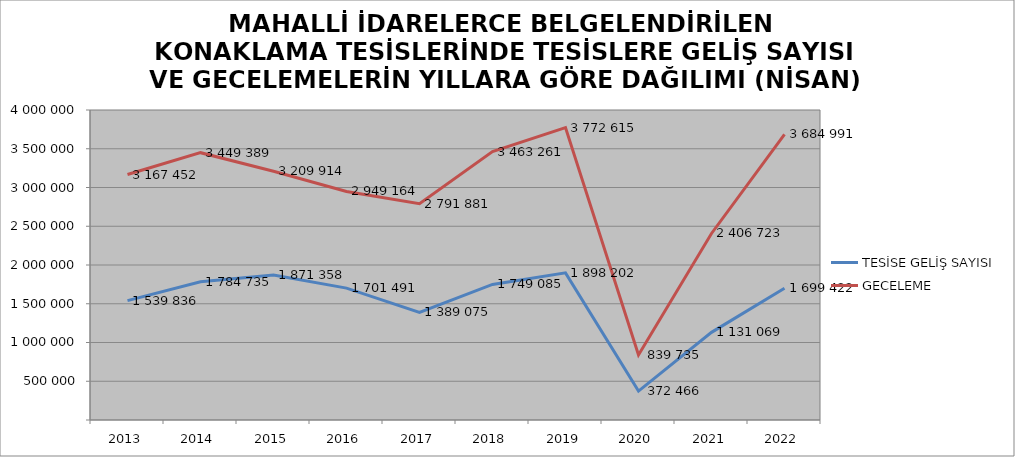
| Category | TESİSE GELİŞ SAYISI | GECELEME |
|---|---|---|
| 2013 | 1539836 | 3167452 |
| 2014 | 1784735 | 3449389 |
| 2015 | 1871358 | 3209914 |
| 2016 | 1701491 | 2949164 |
| 2017 | 1389075 | 2791881 |
| 2018 | 1749085 | 3463261 |
| 2019 | 1898202 | 3772615 |
| 2020 | 372466 | 839735 |
| 2021 | 1131069 | 2406723 |
| 2022 | 1699422 | 3684991 |